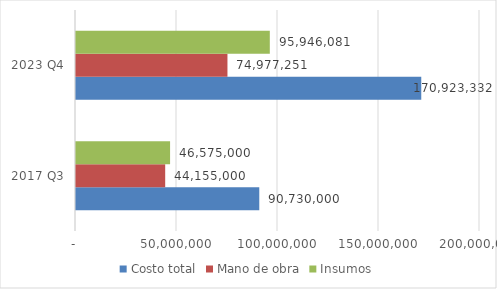
| Category | Costo total | Mano de obra | Insumos |
|---|---|---|---|
| 2017 Q3 | 90730000 | 44155000 | 46575000 |
| 2023 Q4 | 170923331.573 | 74977251 | 95946080.573 |